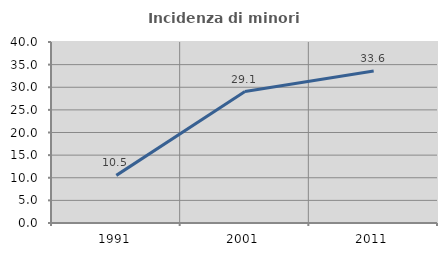
| Category | Incidenza di minori stranieri |
|---|---|
| 1991.0 | 10.526 |
| 2001.0 | 29.054 |
| 2011.0 | 33.582 |